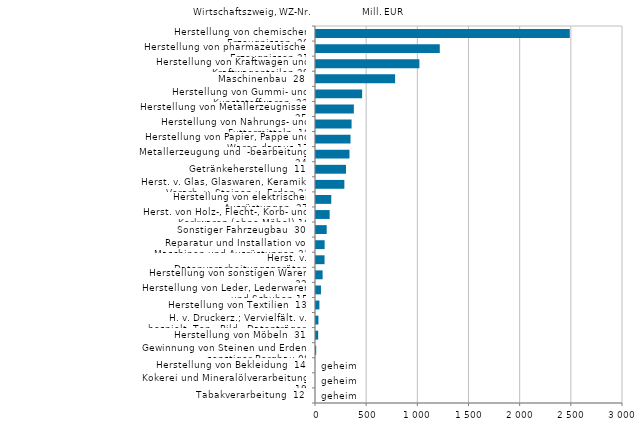
| Category | Series 0 |
|---|---|
| Herstellung von chemischen Erzeugnissen  20 | 2480.105 |
| Herstellung von pharmazeutischen Erzeugnissen 21 | 1209.517 |
| Herstellung von Kraftwagen und Kraftwagenteilen 29 | 1010.264 |
| Maschinenbau  28 | 773.018 |
| Herstellung von Gummi- und Kunststoffwaren  22 | 450.923 |
| Herstellung von Metallerzeugnissen  25 | 369.906 |
| Herstellung von Nahrungs- und Futtermitteln  10 | 347.71 |
| Herstellung von Papier, Pappe und Waren daraus 17 | 337.332 |
| Metallerzeugung und  -bearbeitung  24 | 327.11 |
| Getränkeherstellung  11 | 293.053 |
| Herst. v. Glas, Glaswaren, Keramik, Verarb. v. Steinen u. Erden 23 | 277.11 |
| Herstellung von elektrischen Ausrüstungen  27 | 149.224 |
| Herst. von Holz-, Flecht-, Korb- und Korkwaren (ohne Möbel) 16 | 133.39 |
| Sonstiger Fahrzeugbau  30 | 104.58 |
| Reparatur und Installation von Maschinen und Ausrüstungen 33 | 84.368 |
| Herst. v. Datenverarbeitungsgeräten, elektron. u. opt. Erzeug. 26 | 83.536 |
| Herstellung von sonstigen Waren  32 | 64.798 |
| Herstellung von Leder, Lederwaren und Schuhen 15 | 48.428 |
| Herstellung von Textilien  13 | 33.252 |
| H. v. Druckerz.; Vervielfält. v. bespielt. Ton-, Bild-, Datenträgern 18 | 23.947 |
| Herstellung von Möbeln  31 | 21.211 |
| Gewinnung von Steinen und Erden, sonstiger Bergbau 08 | 1.907 |
| Herstellung von Bekleidung  14 | 0 |
| Kokerei und Mineralölverarbeitung  19 | 0 |
| Tabakverarbeitung  12 | 0 |